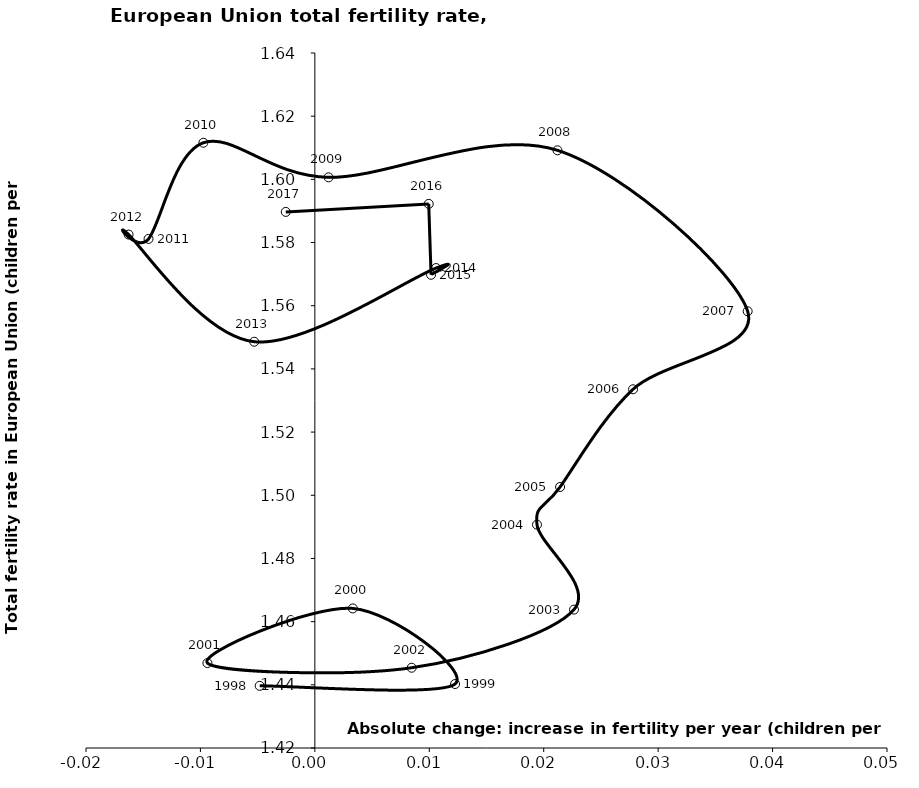
| Category | Series 0 |
|---|---|
| -0.004822598799167577 | 1.44 |
| 0.012253406831075342 | 1.44 |
| 0.0033166918290790104 | 1.464 |
| -0.009388723185678738 | 1.447 |
| 0.008458760059944614 | 1.445 |
| 0.022644793722642165 | 1.464 |
| 0.019411878315983122 | 1.491 |
| 0.021429929229925038 | 1.503 |
| 0.02780626099534611 | 1.534 |
| 0.03782339901643106 | 1.558 |
| 0.02120014323563979 | 1.609 |
| 0.001196641550506805 | 1.601 |
| -0.009740150058960562 | 1.612 |
| -0.014534017359534301 | 1.581 |
| -0.016278545309928782 | 1.583 |
| -0.005297934717971575 | 1.549 |
| 0.010597943805777277 | 1.572 |
| 0.010155662419945477 | 1.57 |
| 0.009951061662402672 | 1.592 |
| -0.0025409427766069914 | 1.59 |